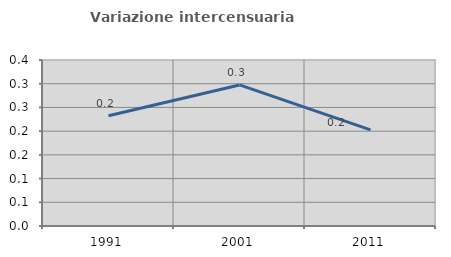
| Category | Variazione intercensuaria annua |
|---|---|
| 1991.0 | 0.232 |
| 2001.0 | 0.297 |
| 2011.0 | 0.203 |